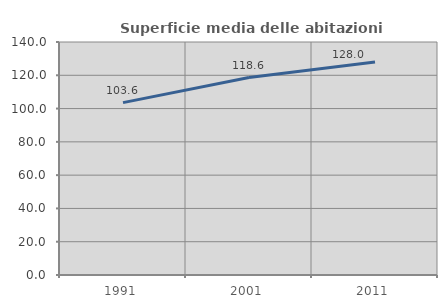
| Category | Superficie media delle abitazioni occupate |
|---|---|
| 1991.0 | 103.578 |
| 2001.0 | 118.625 |
| 2011.0 | 127.952 |